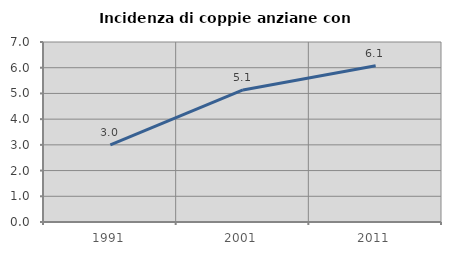
| Category | Incidenza di coppie anziane con figli |
|---|---|
| 1991.0 | 3.001 |
| 2001.0 | 5.134 |
| 2011.0 | 6.074 |